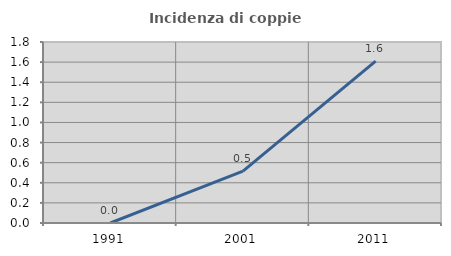
| Category | Incidenza di coppie miste |
|---|---|
| 1991.0 | 0 |
| 2001.0 | 0.515 |
| 2011.0 | 1.609 |